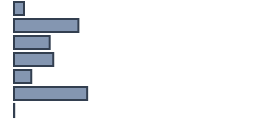
| Category | Percentatge |
|---|---|
| 0 | 4.174 |
| 1 | 26.826 |
| 2 | 14.87 |
| 3 | 16.348 |
| 4 | 7.217 |
| 5 | 30.478 |
| 6 | 0.087 |